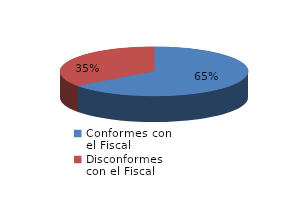
| Category | Series 0 |
|---|---|
| 0 | 91 |
| 1 | 49 |